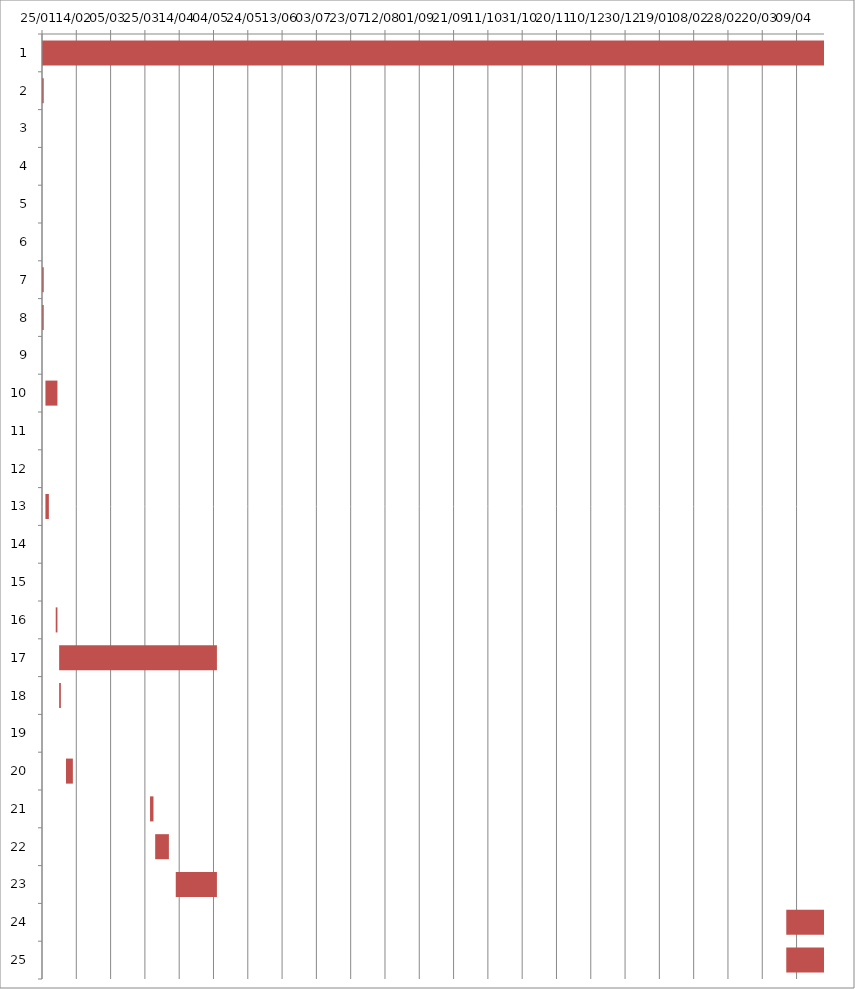
| Category | Fecha de inicio | DURACIÓN |
|---|---|---|
| 0 | 1/25/16 | 584 |
| 1 | 1/25/16 | 1 |
| 2 | 1/25/16 | 0 |
| 3 | 1/25/16 | 0 |
| 4 | 1/25/16 | 0 |
| 5 | 1/25/16 | 0 |
| 6 | 1/25/16 | 1 |
| 7 | 1/25/16 | 1 |
| 8 | 1/26/16 | 0 |
| 9 | 1/27/16 | 7 |
| 10 | 1/27/16 | 0 |
| 11 | 1/28/16 | 0 |
| 12 | 1/27/16 | 2 |
| 13 | 2/1/16 | 0 |
| 14 | 2/2/16 | 0 |
| 15 | 2/2/16 | 1 |
| 16 | 2/4/16 | 92 |
| 17 | 2/4/16 | 1 |
| 18 | 2/5/16 | 0 |
| 19 | 2/8/16 | 4 |
| 20 | 3/28/16 | 2 |
| 21 | 3/31/16 | 8 |
| 22 | 4/12/16 | 24 |
| 23 | 4/3/17 | 150 |
| 24 | 4/3/17 | 150 |